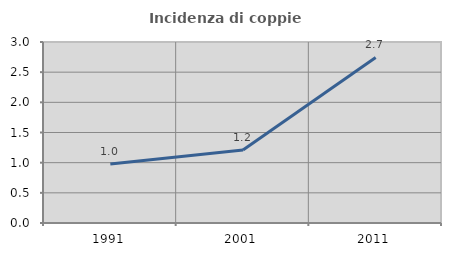
| Category | Incidenza di coppie miste |
|---|---|
| 1991.0 | 0.979 |
| 2001.0 | 1.211 |
| 2011.0 | 2.744 |